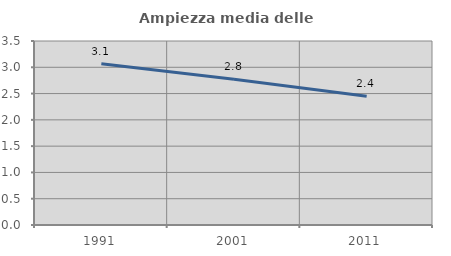
| Category | Ampiezza media delle famiglie |
|---|---|
| 1991.0 | 3.069 |
| 2001.0 | 2.772 |
| 2011.0 | 2.448 |